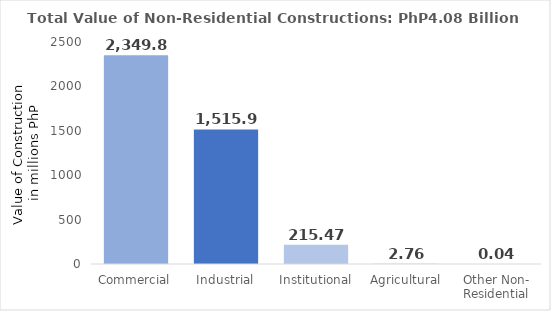
| Category | No |
|---|---|
| Commercial | 2349.861 |
| Industrial | 1515.937 |
| Institutional | 215.472 |
| Agricultural | 2.756 |
| Other Non- Residential | 0.04 |